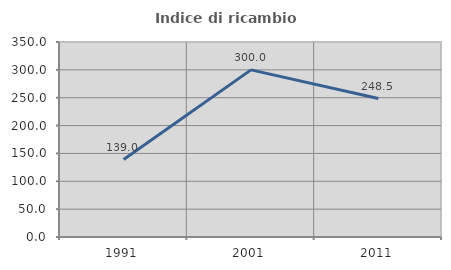
| Category | Indice di ricambio occupazionale  |
|---|---|
| 1991.0 | 139.024 |
| 2001.0 | 300 |
| 2011.0 | 248.485 |